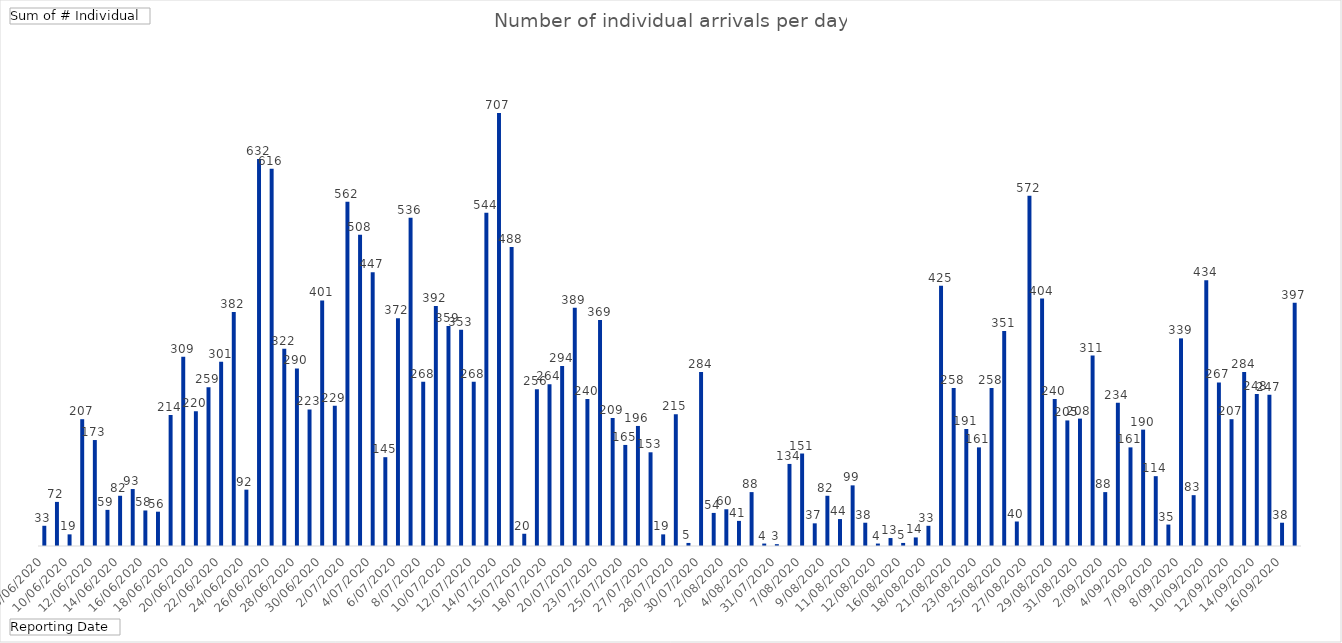
| Category | Total |
|---|---|
| 8/06/2020 | 33 |
| 9/06/2020 | 72 |
| 10/06/2020 | 19 |
| 11/06/2020 | 207 |
| 12/06/2020 | 173 |
| 13/06/2020 | 59 |
| 14/06/2020 | 82 |
| 15/06/2020 | 93 |
| 16/06/2020 | 58 |
| 17/06/2020 | 56 |
| 18/06/2020 | 214 |
| 19/06/2020 | 309 |
| 20/06/2020 | 220 |
| 21/06/2020 | 259 |
| 22/06/2020 | 301 |
| 23/06/2020 | 382 |
| 24/06/2020 | 92 |
| 25/06/2020 | 632 |
| 26/06/2020 | 616 |
| 27/06/2020 | 322 |
| 28/06/2020 | 290 |
| 29/06/2020 | 223 |
| 30/06/2020 | 401 |
| 1/07/2020 | 229 |
| 2/07/2020 | 562 |
| 3/07/2020 | 508 |
| 4/07/2020 | 447 |
| 5/07/2020 | 145 |
| 6/07/2020 | 372 |
| 7/07/2020 | 536 |
| 8/07/2020 | 268 |
| 9/07/2020 | 392 |
| 10/07/2020 | 359 |
| 11/07/2020 | 353 |
| 12/07/2020 | 268 |
| 13/07/2020 | 544 |
| 14/07/2020 | 707 |
| 16/07/2020 | 488 |
| 15/07/2020 | 20 |
| 17/07/2020 | 256 |
| 18/07/2020 | 264 |
| 19/07/2020 | 294 |
| 20/07/2020 | 389 |
| 21/07/2020 | 240 |
| 23/07/2020 | 369 |
| 24/07/2020 | 209 |
| 25/07/2020 | 165 |
| 26/07/2020 | 196 |
| 27/07/2020 | 153 |
| 22/07/2020 | 19 |
| 28/07/2020 | 215 |
| 29/07/2020 | 5 |
| 30/07/2020 | 284 |
| 1/08/2020 | 54 |
| 2/08/2020 | 60 |
| 3/08/2020 | 41 |
| 4/08/2020 | 88 |
| 5/08/2020 | 4 |
| 31/07/2020 | 3 |
| 6/08/2020 | 134 |
| 7/08/2020 | 151 |
| 8/08/2020 | 37 |
| 9/08/2020 | 82 |
| 10/08/2020 | 44 |
| 11/08/2020 | 99 |
| 13/08/2020 | 38 |
| 12/08/2020 | 4 |
| 14/08/2020 | 13 |
| 16/08/2020 | 5 |
| 17/08/2020 | 14 |
| 18/08/2020 | 33 |
| 20/08/2020 | 425 |
| 21/08/2020 | 258 |
| 22/08/2020 | 191 |
| 23/08/2020 | 161 |
| 24/08/2020 | 258 |
| 25/08/2020 | 351 |
| 26/08/2020 | 40 |
| 27/08/2020 | 572 |
| 28/08/2020 | 404 |
| 29/08/2020 | 240 |
| 30/08/2020 | 205 |
| 31/08/2020 | 208 |
| 1/09/2020 | 311 |
| 2/09/2020 | 88 |
| 3/09/2020 | 234 |
| 4/09/2020 | 161 |
| 6/09/2020 | 190 |
| 7/09/2020 | 114 |
| 5/09/2020 | 35 |
| 8/09/2020 | 339 |
| 9/09/2020 | 83 |
| 10/09/2020 | 434 |
| 11/09/2020 | 267 |
| 12/09/2020 | 207 |
| 13/09/2020 | 284 |
| 14/09/2020 | 248 |
| 15/09/2020 | 247 |
| 16/09/2020 | 38 |
| 17/09/2020 | 397 |